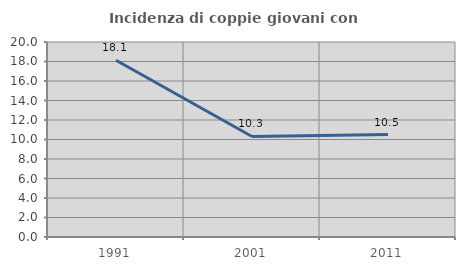
| Category | Incidenza di coppie giovani con figli |
|---|---|
| 1991.0 | 18.132 |
| 2001.0 | 10.309 |
| 2011.0 | 10.501 |